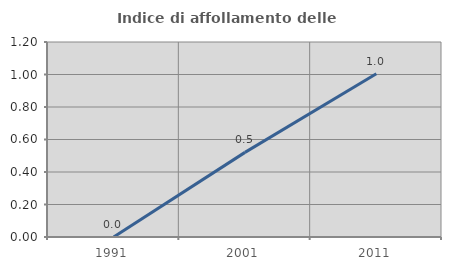
| Category | Indice di affollamento delle abitazioni  |
|---|---|
| 1991.0 | 0 |
| 2001.0 | 0.521 |
| 2011.0 | 1.005 |